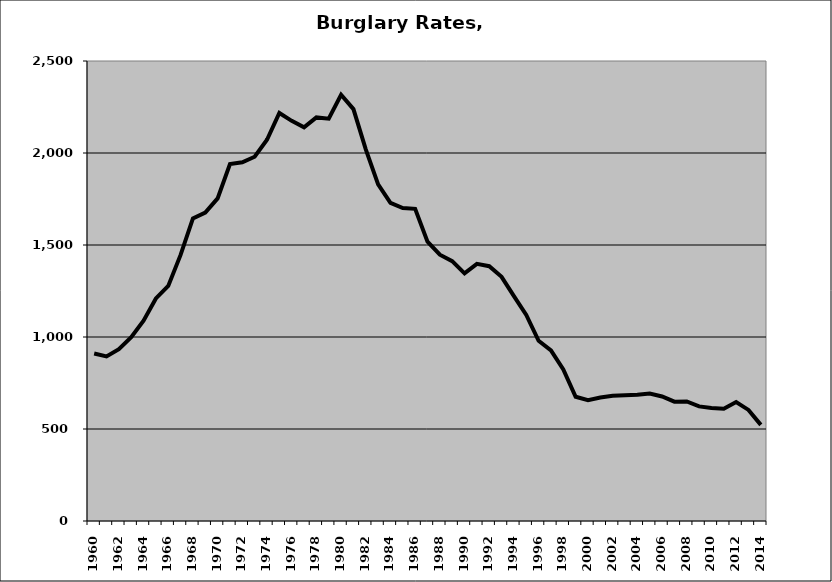
| Category | Burglary |
|---|---|
| 1960.0 | 910.48 |
| 1961.0 | 894.157 |
| 1962.0 | 934.137 |
| 1963.0 | 998.88 |
| 1964.0 | 1088.714 |
| 1965.0 | 1209.585 |
| 1966.0 | 1277.439 |
| 1967.0 | 1446.029 |
| 1968.0 | 1644.457 |
| 1969.0 | 1676.135 |
| 1970.0 | 1753.048 |
| 1971.0 | 1939.757 |
| 1972.0 | 1949.189 |
| 1973.0 | 1979.632 |
| 1974.0 | 2072.005 |
| 1975.0 | 2217.257 |
| 1976.0 | 2174.628 |
| 1977.0 | 2139.441 |
| 1978.0 | 2193.263 |
| 1979.0 | 2186.773 |
| 1980.0 | 2316.515 |
| 1981.0 | 2238.528 |
| 1982.0 | 2020.167 |
| 1983.0 | 1829.109 |
| 1984.0 | 1729.35 |
| 1985.0 | 1701.142 |
| 1986.0 | 1696.372 |
| 1987.0 | 1518.161 |
| 1988.0 | 1447.142 |
| 1989.0 | 1412.339 |
| 1990.0 | 1345.402 |
| 1991.0 | 1397.814 |
| 1992.0 | 1384.945 |
| 1993.0 | 1327.039 |
| 1994.0 | 1222.541 |
| 1995.0 | 1120.311 |
| 1996.0 | 979.396 |
| 1997.0 | 927.358 |
| 1998.0 | 823.498 |
| 1999.0 | 675.255 |
| 2000.0 | 656.28 |
| 2001.0 | 671.3 |
| 2002.0 | 681.184 |
| 2003.0 | 683.18 |
| 2004.0 | 686.074 |
| 2005.0 | 692.925 |
| 2006.0 | 676.905 |
| 2007.0 | 648.416 |
| 2008.0 | 649.868 |
| 2009.0 | 622.802 |
| 2010.0 | 614.316 |
| 2011.0 | 610.539 |
| 2012.0 | 646.757 |
| 2013.0 | 603.824 |
| 2014.0 | 522.312 |